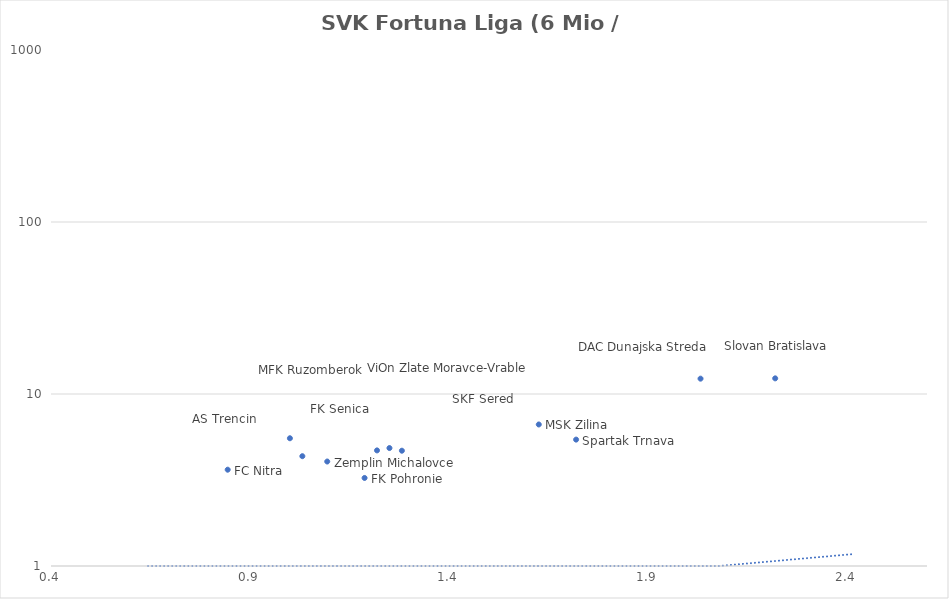
| Category | Series 0 |
|---|---|
| 2.21875 | 12.33 |
| 2.03125 | 12.28 |
| 1.71875 | 5.43 |
| 1.625 | 6.65 |
| 1.25 | 4.85 |
| 1.0 | 5.53 |
| 1.28125 | 4.68 |
| 1.21875 | 4.7 |
| 1.1875 | 3.25 |
| 1.09375 | 4.05 |
| 1.03125 | 4.35 |
| 0.84375 | 3.63 |